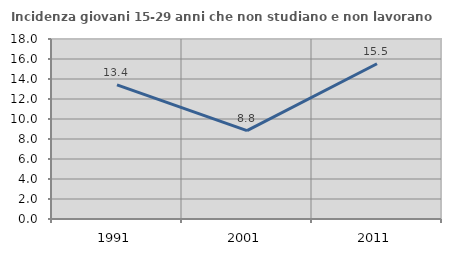
| Category | Incidenza giovani 15-29 anni che non studiano e non lavorano  |
|---|---|
| 1991.0 | 13.419 |
| 2001.0 | 8.831 |
| 2011.0 | 15.522 |